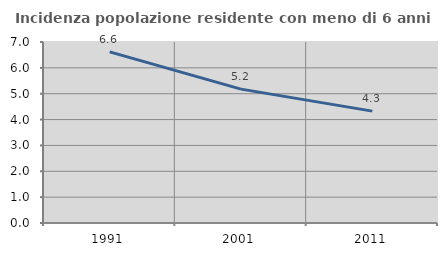
| Category | Incidenza popolazione residente con meno di 6 anni |
|---|---|
| 1991.0 | 6.618 |
| 2001.0 | 5.177 |
| 2011.0 | 4.326 |